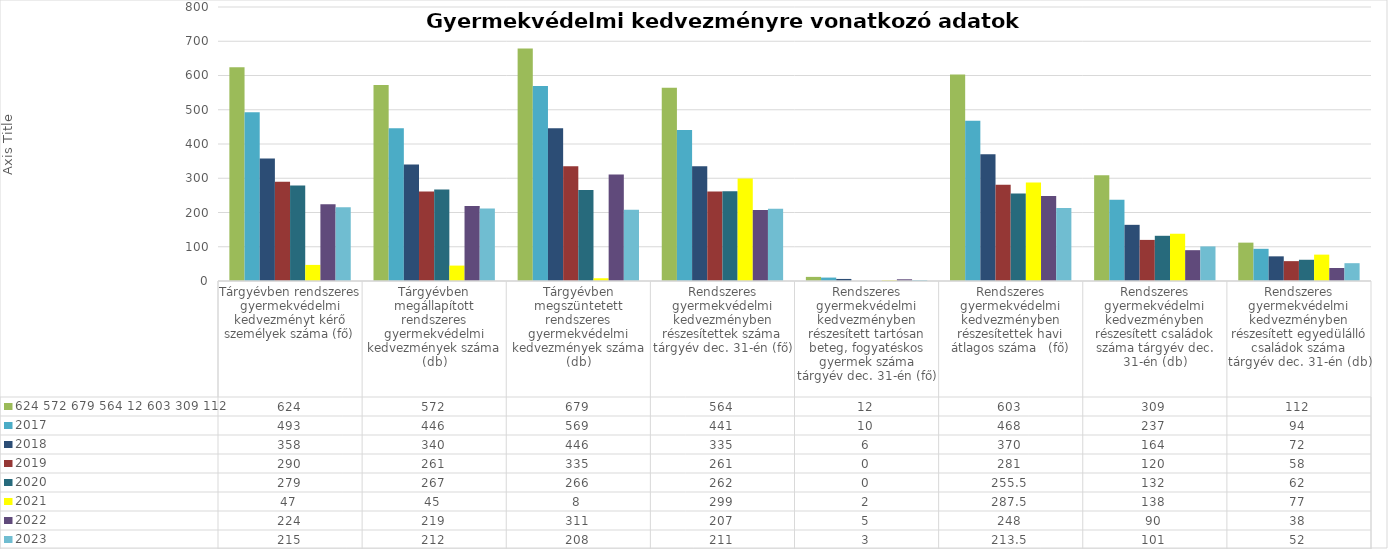
| Category | 624 | 2017 | 2018 | 2019 | 2020 | 2021 | 2022 | 2023 |
|---|---|---|---|---|---|---|---|---|
| Tárgyévben rendszeres gyermekvédelmi kedvezményt kérő személyek száma (fő) | 624 | 493 | 358 | 290 | 279 | 47 | 224 | 215 |
| Tárgyévben megállapított rendszeres gyermekvédelmi kedvezmények száma (db) | 572 | 446 | 340 | 261 | 267 | 45 | 219 | 212 |
| Tárgyévben megszüntetett rendszeres gyermekvédelmi kedvezmények száma (db) | 679 | 569 | 446 | 335 | 266 | 8 | 311 | 208 |
| Rendszeres gyermekvédelmi kedvezményben részesítettek száma tárgyév dec. 31-én (fő) | 564 | 441 | 335 | 261 | 262 | 299 | 207 | 211 |
| Rendszeres gyermekvédelmi kedvezményben részesített tartósan beteg, fogyatéskos gyermek száma tárgyév dec. 31-én (fő) | 12 | 10 | 6 | 0 | 0 | 2 | 5 | 3 |
| Rendszeres gyermekvédelmi kedvezményben részesítettek havi átlagos száma   (fő) | 603 | 468 | 370 | 281 | 255.5 | 287.5 | 248 | 213.5 |
| Rendszeres gyermekvédelmi kedvezményben részesített családok száma tárgyév dec. 31-én (db) | 309 | 237 | 164 | 120 | 132 | 138 | 90 | 101 |
| Rendszeres gyermekvédelmi kedvezményben részesített egyedülálló családok száma tárgyév dec. 31-én (db) | 112 | 94 | 72 | 58 | 62 | 77 | 38 | 52 |